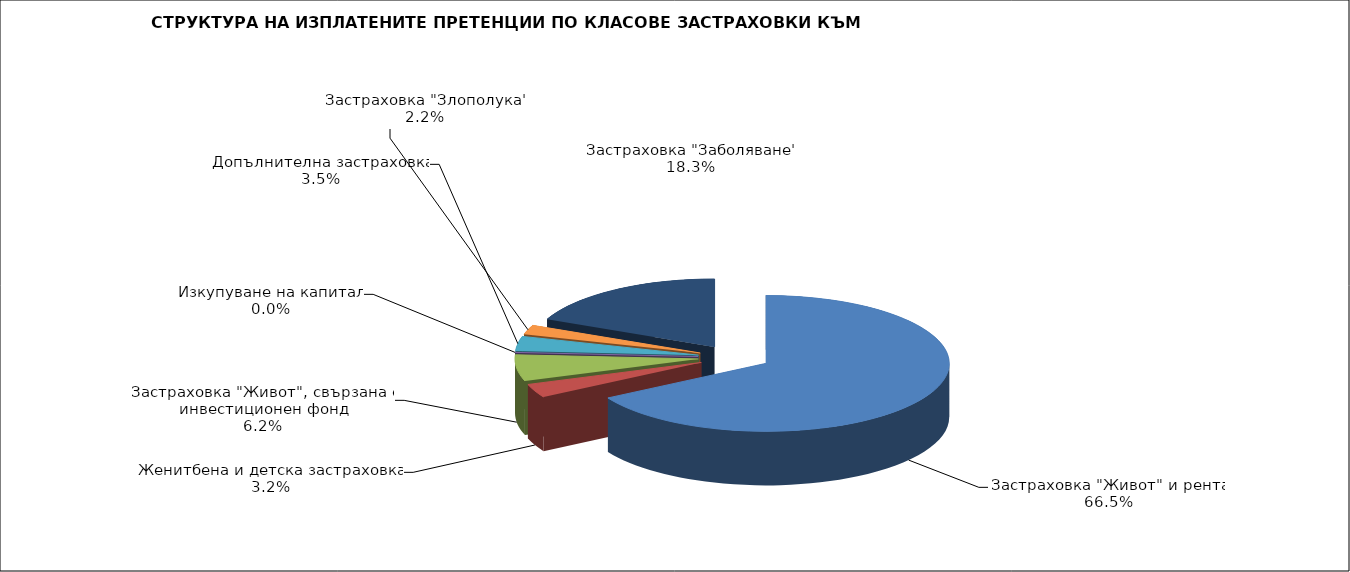
| Category | 33 175 673 |
|---|---|
| Застраховка "Живот" и рента | 33175672.657 |
| Женитбена и детска застраховка | 1616558.668 |
| Застраховка "Живот", свързана с инвестиционен фонд | 3105472.022 |
| Изкупуване на капитал | 0 |
| Допълнителна застраховка | 1741972.472 |
| Застраховка "Злополука" | 1108299.071 |
| Застраховка "Заболяване" | 9140077.986 |